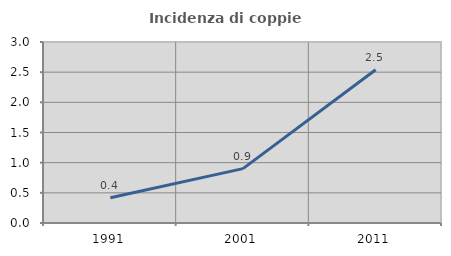
| Category | Incidenza di coppie miste |
|---|---|
| 1991.0 | 0.419 |
| 2001.0 | 0.901 |
| 2011.0 | 2.539 |